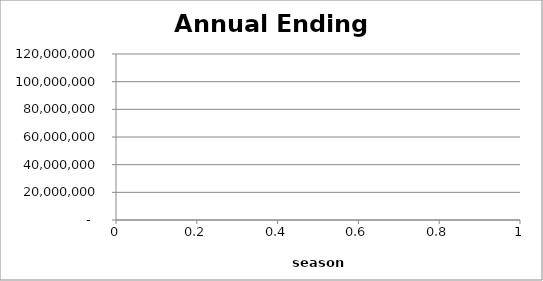
| Category | Series 0 |
|---|---|
| 0 | 18797382.22 |
| 1 | 20774486.756 |
| 2 | 23123353.41 |
| 3 | 23683726.492 |
| 4 | 23861365.952 |
| 5 | 23757912.754 |
| 6 | 24839231.319 |
| 7 | 25715448.205 |
| 8 | 26517085.97 |
| 9 | 26797056.388 |
| 10 | 28221183.145 |
| 11 | 29544080.681 |
| 12 | 31996277.8 |
| 13 | 33627018.499 |
| 14 | 35279839.739 |
| 15 | 37281175.777 |
| 16 | 40234226.33 |
| 17 | 45309629.159 |
| 18 | 50774094.818 |
| 19 | 56325490.704 |
| 20 | 64051886.289 |
| 21 | 73797305.208 |
| 22 | 84213189.857 |
| 23 | 96215298.197 |
| 24 | 112678501.011 |